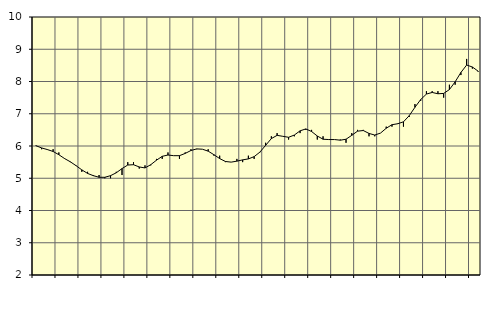
| Category | Piggar | Information och kommunikation, SNI 58-63 |
|---|---|---|
| nan | 6 | 6.01 |
| 1.0 | 5.9 | 5.94 |
| 1.0 | 5.9 | 5.89 |
| 1.0 | 5.9 | 5.83 |
| nan | 5.8 | 5.73 |
| 2.0 | 5.6 | 5.61 |
| 2.0 | 5.5 | 5.51 |
| 2.0 | 5.4 | 5.39 |
| nan | 5.2 | 5.26 |
| 3.0 | 5.2 | 5.15 |
| 3.0 | 5.1 | 5.08 |
| 3.0 | 5.1 | 5.03 |
| nan | 5 | 5.03 |
| 4.0 | 5 | 5.08 |
| 4.0 | 5.2 | 5.17 |
| 4.0 | 5.1 | 5.3 |
| nan | 5.5 | 5.41 |
| 5.0 | 5.5 | 5.42 |
| 5.0 | 5.3 | 5.35 |
| 5.0 | 5.4 | 5.32 |
| nan | 5.4 | 5.42 |
| 6.0 | 5.6 | 5.56 |
| 6.0 | 5.6 | 5.68 |
| 6.0 | 5.8 | 5.72 |
| nan | 5.7 | 5.7 |
| 7.0 | 5.6 | 5.7 |
| 7.0 | 5.8 | 5.77 |
| 7.0 | 5.9 | 5.86 |
| nan | 5.9 | 5.91 |
| 8.0 | 5.9 | 5.9 |
| 8.0 | 5.9 | 5.84 |
| 8.0 | 5.7 | 5.73 |
| nan | 5.7 | 5.61 |
| 9.0 | 5.5 | 5.52 |
| 9.0 | 5.5 | 5.5 |
| 9.0 | 5.6 | 5.53 |
| nan | 5.5 | 5.57 |
| 10.0 | 5.7 | 5.6 |
| 10.0 | 5.6 | 5.67 |
| 10.0 | 5.8 | 5.81 |
| nan | 6.1 | 6.02 |
| 11.0 | 6.3 | 6.23 |
| 11.0 | 6.4 | 6.33 |
| 11.0 | 6.3 | 6.3 |
| nan | 6.2 | 6.27 |
| 12.0 | 6.3 | 6.34 |
| 12.0 | 6.4 | 6.47 |
| 12.0 | 6.5 | 6.53 |
| nan | 6.5 | 6.45 |
| 13.0 | 6.2 | 6.31 |
| 13.0 | 6.3 | 6.21 |
| 13.0 | 6.2 | 6.2 |
| nan | 6.2 | 6.2 |
| 14.0 | 6.2 | 6.18 |
| 14.0 | 6.1 | 6.21 |
| 14.0 | 6.4 | 6.33 |
| nan | 6.5 | 6.46 |
| 15.0 | 6.5 | 6.48 |
| 15.0 | 6.3 | 6.39 |
| 15.0 | 6.3 | 6.34 |
| nan | 6.4 | 6.4 |
| 16.0 | 6.6 | 6.55 |
| 16.0 | 6.6 | 6.66 |
| 16.0 | 6.7 | 6.69 |
| nan | 6.6 | 6.75 |
| 17.0 | 6.9 | 6.94 |
| 17.0 | 7.3 | 7.2 |
| 17.0 | 7.4 | 7.44 |
| nan | 7.7 | 7.61 |
| 18.0 | 7.7 | 7.66 |
| 18.0 | 7.7 | 7.62 |
| 18.0 | 7.5 | 7.63 |
| nan | 7.9 | 7.75 |
| 19.0 | 7.9 | 7.99 |
| 19.0 | 8.2 | 8.28 |
| 19.0 | 8.7 | 8.51 |
| nan | 8.4 | 8.45 |
| 20.0 | 8.3 | 8.32 |